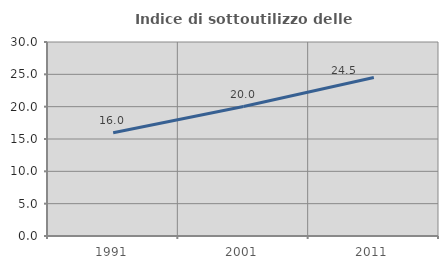
| Category | Indice di sottoutilizzo delle abitazioni  |
|---|---|
| 1991.0 | 15.955 |
| 2001.0 | 20.019 |
| 2011.0 | 24.498 |